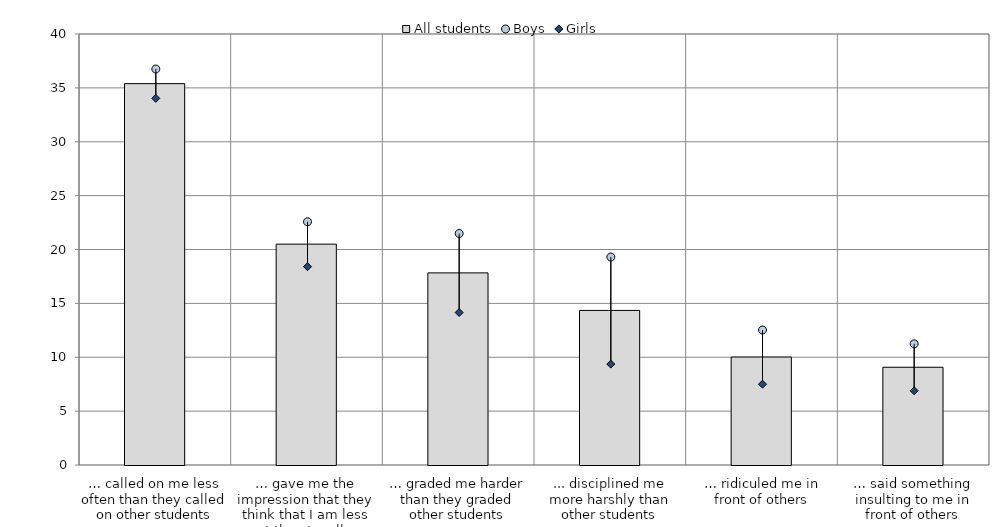
| Category | All students |
|---|---|
| … called on me less often than they called on other students | 35.393 |
| … gave me the impression that they think that I am less smart than I really am | 20.498 |
| … graded me harder than they graded other students | 17.83 |
| ... disciplined me more harshly than other students | 14.344 |
| … ridiculed me in front of others | 10.02 |
| … said something insulting to me in front of others | 9.072 |